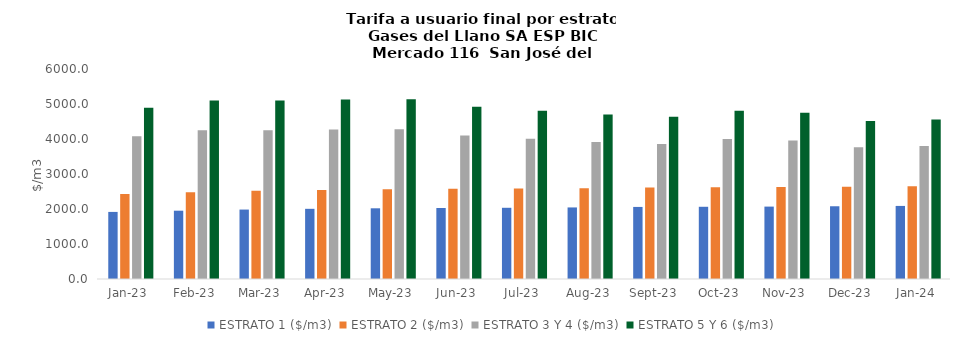
| Category | ESTRATO 1 ($/m3) | ESTRATO 2 ($/m3) | ESTRATO 3 Y 4 ($/m3) | ESTRATO 5 Y 6 ($/m3) |
|---|---|---|---|---|
| 2023-01-01 | 1916.75 | 2431.28 | 4077.6 | 4893.12 |
| 2023-02-01 | 1951.54 | 2475.41 | 4250.37 | 5100.444 |
| 2023-03-01 | 1984.02 | 2519.25 | 4250.37 | 5100.444 |
| 2023-04-01 | 2005.09 | 2546.01 | 4273.76 | 5128.512 |
| 2023-05-01 | 2020.1 | 2565.07 | 4279.7 | 5135.64 |
| 2023-06-01 | 2028.44 | 2575.66 | 4098.64 | 4918.368 |
| 2023-07-01 | 2034.66 | 2583.55 | 4008.82 | 4810.584 |
| 2023-08-01 | 2044.67 | 2596.26 | 3914.14 | 4696.968 |
| 2023-09-01 | 2059.07 | 2614.55 | 3860.26 | 4632.312 |
| 2023-10-01 | 2063.47 | 2620.13 | 4003.57 | 4804.284 |
| 2023-11-01 | 2068.62 | 2626.68 | 3959.2 | 4751.04 |
| 2023-12-01 | 2078.32 | 2639 | 3760.95 | 4513.14 |
| 2024-01-01 | 2087.87 | 2651.13 | 3797.87 | 4557.444 |